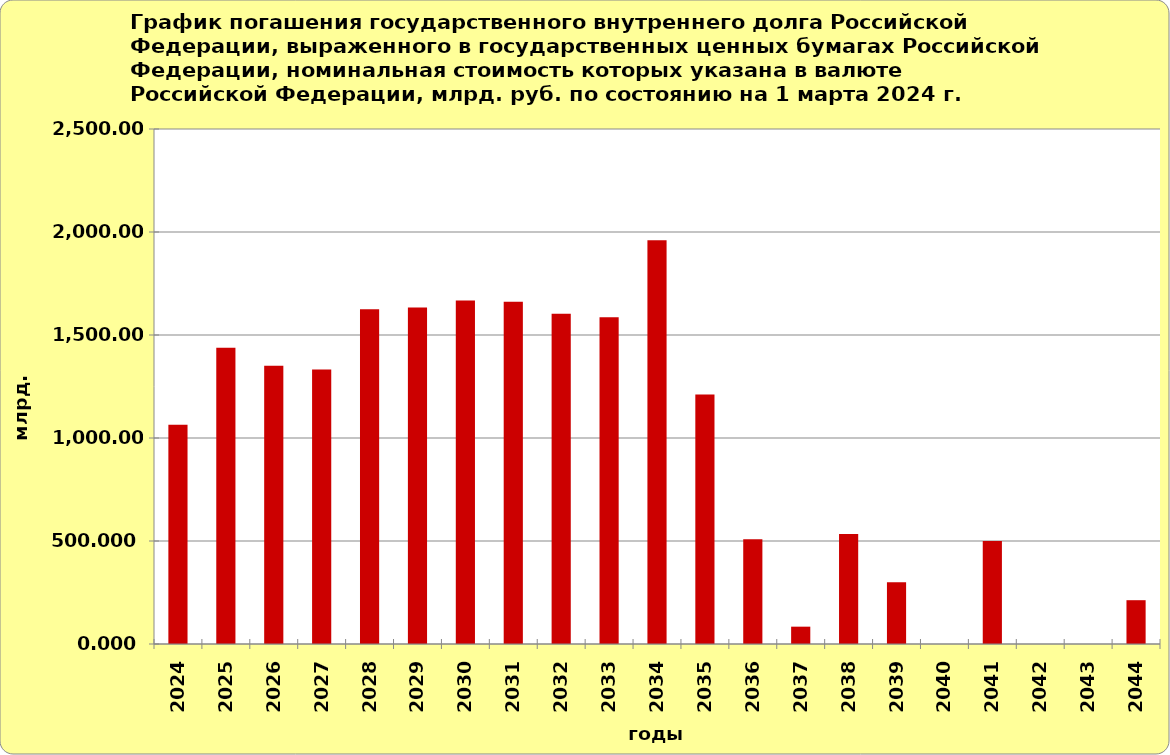
| Category | Series 1 |
|---|---|
| 2024.0 | 1064.485 |
| 2025.0 | 1437.623 |
| 2026.0 | 1351.311 |
| 2027.0 | 1332.679 |
| 2028.0 | 1624.793 |
| 2029.0 | 1633.774 |
| 2030.0 | 1667.088 |
| 2031.0 | 1661.564 |
| 2032.0 | 1602.874 |
| 2033.0 | 1586.272 |
| 2034.0 | 1960.106 |
| 2035.0 | 1210.91 |
| 2036.0 | 508.553 |
| 2037.0 | 84.139 |
| 2038.0 | 534.049 |
| 2039.0 | 300 |
| 2040.0 | 0 |
| 2041.0 | 500 |
| 2042.0 | 0 |
| 2043.0 | 0 |
| 2044.0 | 212.636 |